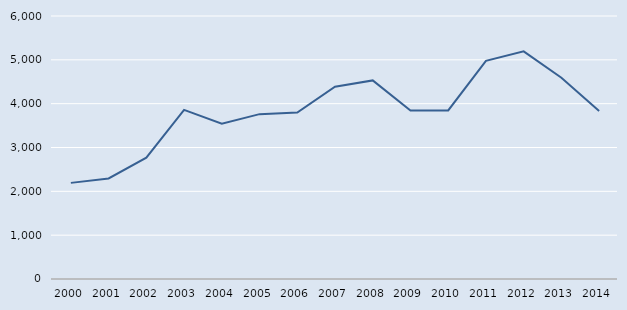
| Category | Series 0 |
|---|---|
| 2000.0 | 2193 |
| 2001.0 | 2293 |
| 2002.0 | 2767 |
| 2003.0 | 3857 |
| 2004.0 | 3542 |
| 2005.0 | 3761 |
| 2006.0 | 3796 |
| 2007.0 | 4385 |
| 2008.0 | 4531 |
| 2009.0 | 3844 |
| 2010.0 | 3845 |
| 2011.0 | 4977 |
| 2012.0 | 5193 |
| 2013.0 | 4590 |
| 2014.0 | 3832 |